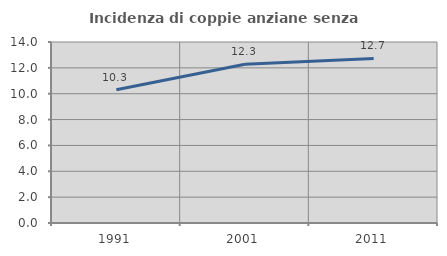
| Category | Incidenza di coppie anziane senza figli  |
|---|---|
| 1991.0 | 10.309 |
| 2001.0 | 12.274 |
| 2011.0 | 12.724 |